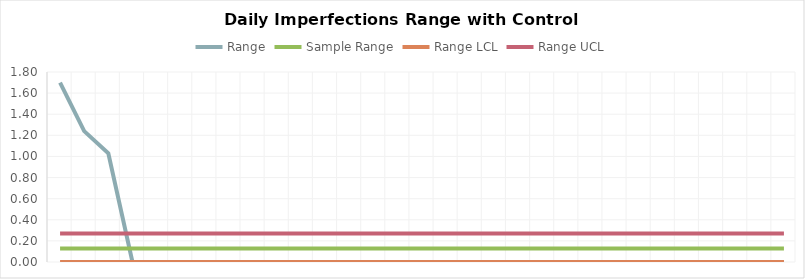
| Category | Range | Sample Range | Range LCL | Range UCL |
|---|---|---|---|---|
| 0 | 1.7 | 0.128 | 0 | 0.271 |
| 1 | 1.24 | 0.128 | 0 | 0.271 |
| 2 | 1.03 | 0.128 | 0 | 0.271 |
| 3 | 0 | 0.128 | 0 | 0.271 |
| 4 | 0 | 0.128 | 0 | 0.271 |
| 5 | 0 | 0.128 | 0 | 0.271 |
| 6 | 0 | 0.128 | 0 | 0.271 |
| 7 | 0 | 0.128 | 0 | 0.271 |
| 8 | 0 | 0.128 | 0 | 0.271 |
| 9 | 0 | 0.128 | 0 | 0.271 |
| 10 | 0 | 0.128 | 0 | 0.271 |
| 11 | 0 | 0.128 | 0 | 0.271 |
| 12 | 0 | 0.128 | 0 | 0.271 |
| 13 | 0 | 0.128 | 0 | 0.271 |
| 14 | 0 | 0.128 | 0 | 0.271 |
| 15 | 0 | 0.128 | 0 | 0.271 |
| 16 | 0 | 0.128 | 0 | 0.271 |
| 17 | 0 | 0.128 | 0 | 0.271 |
| 18 | 0 | 0.128 | 0 | 0.271 |
| 19 | 0 | 0.128 | 0 | 0.271 |
| 20 | 0 | 0.128 | 0 | 0.271 |
| 21 | 0 | 0.128 | 0 | 0.271 |
| 22 | 0 | 0.128 | 0 | 0.271 |
| 23 | 0 | 0.128 | 0 | 0.271 |
| 24 | 0 | 0.128 | 0 | 0.271 |
| 25 | 0 | 0.128 | 0 | 0.271 |
| 26 | 0 | 0.128 | 0 | 0.271 |
| 27 | 0 | 0.128 | 0 | 0.271 |
| 28 | 0 | 0.128 | 0 | 0.271 |
| 29 | 0 | 0.128 | 0 | 0.271 |
| 30 | 0 | 0.128 | 0 | 0.271 |